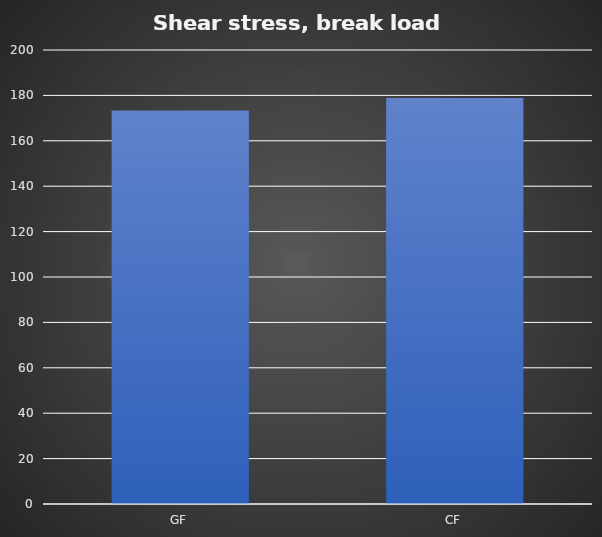
| Category | Break kg |
|---|---|
| GF | 173.4 |
| CF | 178.8 |